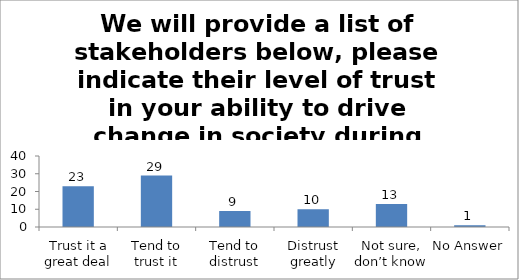
| Category | We will provide a list of stakeholders below, please indicate their level of trust in your ability to drive change in society during studies. (Employers ) |
|---|---|
| Trust it a great deal | 23 |
| Tend to trust it | 29 |
| Tend to distrust | 9 |
| Distrust greatly | 10 |
| Not sure, don’t know | 13 |
| No Answer | 1 |